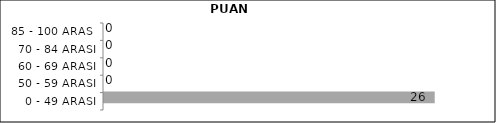
| Category | Series 0 | Series 1 | Series 2 |
|---|---|---|---|
| 0 - 49 ARASI |  |  | 26 |
| 50 - 59 ARASI |  |  | 0 |
| 60 - 69 ARASI |  |  | 0 |
| 70 - 84 ARASI |  |  | 0 |
| 85 - 100 ARASI |  |  | 0 |